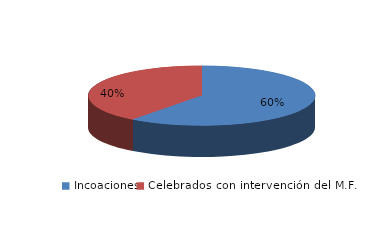
| Category | Series 0 |
|---|---|
| Incoaciones | 1788 |
| Celebrados con intervención del M.F. | 1177 |